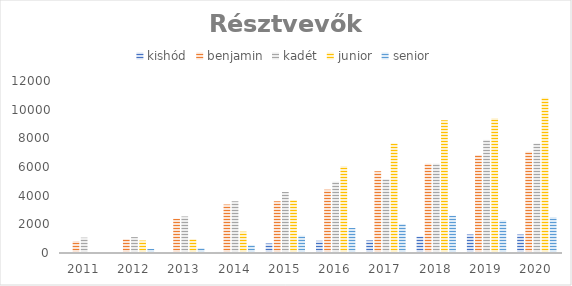
| Category | kishód | benjamin | kadét | junior | senior |
|---|---|---|---|---|---|
| 2011 | 0 | 835 | 1072 | 0 | 0 |
| 2012 | 0 | 967 | 1110 | 869 | 287 |
| 2013 | 0 | 2390 | 2550 | 965 | 341 |
| 2014 | 75 | 3383 | 3610 | 1489 | 549 |
| 2015 | 666 | 3609 | 4257 | 3698 | 1208 |
| 2016 | 854 | 4419 | 4974 | 6054 | 1745 |
| 2017 | 879 | 5703 | 5155 | 7647 | 2027 |
| 2018 | 1145 | 6232 | 6232 | 9254 | 2601 |
| 2019 | 1293 | 6834 | 7893 | 9404 | 2278 |
| 2020 | 1290 | 7066 | 7640 | 10840 | 2505 |